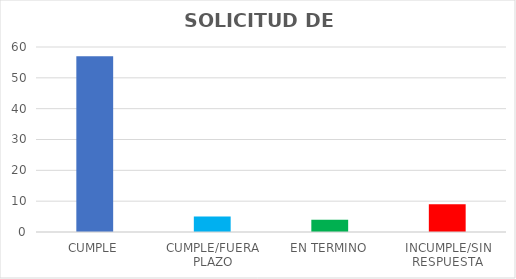
| Category | TOTAL |
|---|---|
| CUMPLE | 57 |
| CUMPLE/FUERA PLAZO | 5 |
| EN TERMINO | 4 |
| INCUMPLE/SIN RESPUESTA | 9 |